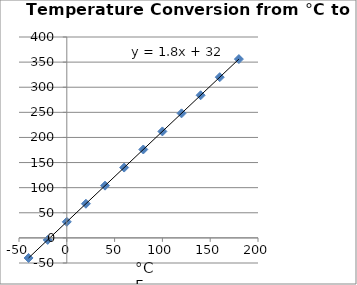
| Category | °F  |
|---|---|
| -40.0 | -40 |
| -20.0 | -4 |
| 0.0 | 32 |
| 20.0 | 68 |
| 40.0 | 104 |
| 60.0 | 140 |
| 80.0 | 176 |
| 100.0 | 212 |
| 120.0 | 248 |
| 140.0 | 284 |
| 160.0 | 320 |
| 180.0 | 356 |